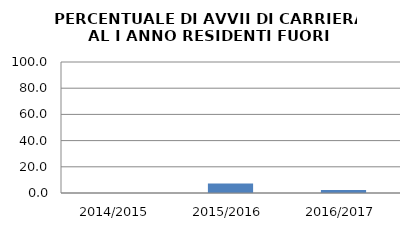
| Category | 2014/2015 2015/2016 2016/2017 |
|---|---|
| 2014/2015 | 0 |
| 2015/2016 | 7.317 |
| 2016/2017 | 2.273 |